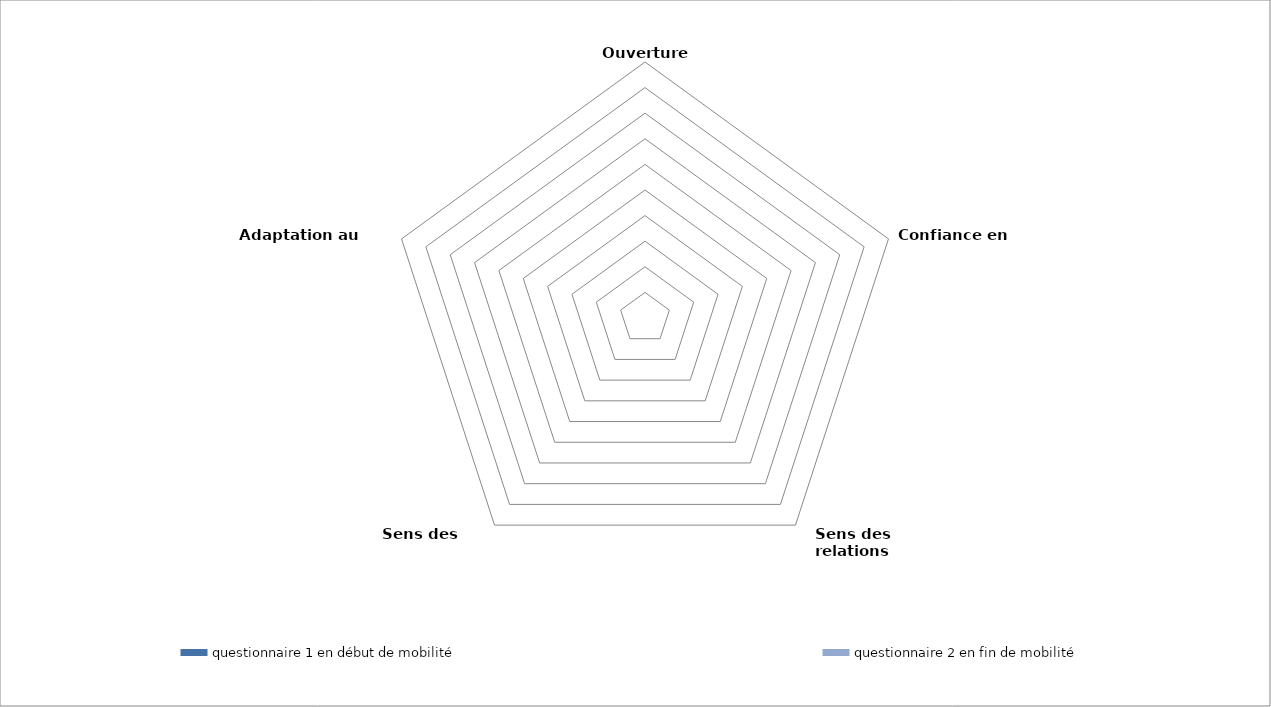
| Category | questionnaire 1 en début de mobilité | questionnaire 2 en fin de mobilité  |
|---|---|---|
| Ouverture d'esprit | 0 | 0 |
| Confiance en soi | 0 | 0 |
| Sens des relations interpersonnelles | 0 | 0 |
| Sens des responsabilités | 0 | 0 |
| Adaptation au changement | 0 | 0 |